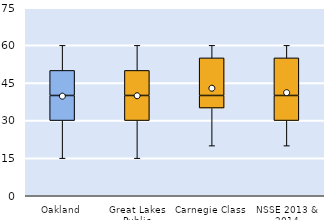
| Category | 25th | 50th | 75th |
|---|---|---|---|
| Oakland | 30 | 10 | 10 |
| Great Lakes Public | 30 | 10 | 10 |
| Carnegie Class | 35 | 5 | 15 |
| NSSE 2013 & 2014 | 30 | 10 | 15 |